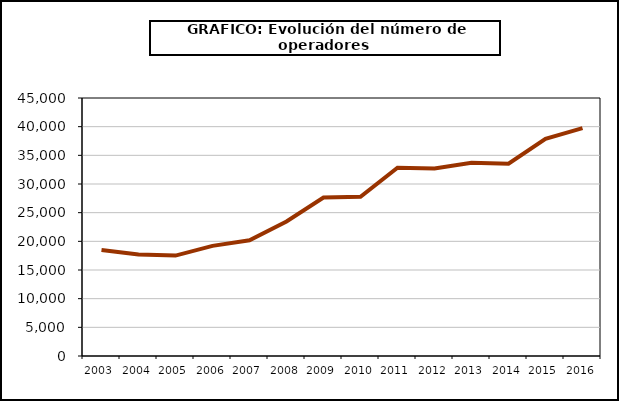
| Category | Operadores (*) |
|---|---|
| 2003.0 | 18505 |
| 2004.0 | 17688 |
| 2005.0 | 17509 |
| 2006.0 | 19211 |
| 2007.0 | 20171 |
| 2008.0 | 23473 |
| 2009.0 | 27627 |
| 2010.0 | 27767 |
| 2011.0 | 32837 |
| 2012.0 | 32724 |
| 2013.0 | 33704 |
| 2014.0 | 33539 |
| 2015.0 | 37870 |
| 2016.0 | 39744 |